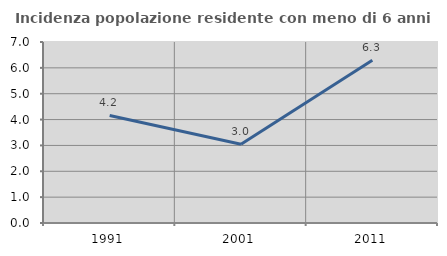
| Category | Incidenza popolazione residente con meno di 6 anni |
|---|---|
| 1991.0 | 4.16 |
| 2001.0 | 3.047 |
| 2011.0 | 6.293 |